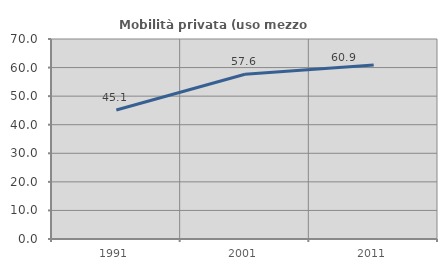
| Category | Mobilità privata (uso mezzo privato) |
|---|---|
| 1991.0 | 45.146 |
| 2001.0 | 57.639 |
| 2011.0 | 60.932 |